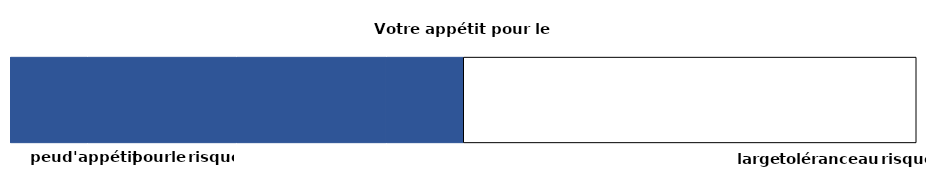
| Category | beleggingsvoorkeur | reactie bij sterke daling | gevoeligheid voor schommelingen | mogelijkheid om verlies op te vangen | maximale score |
|---|---|---|---|---|---|
| 0 | 0.085 | 0.165 | 0.165 | 0.085 | 0.5 |